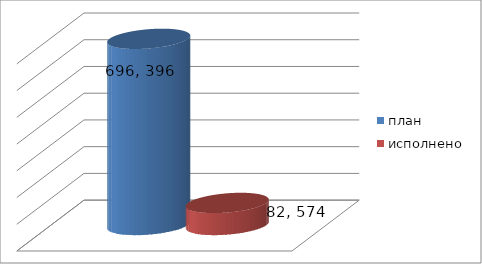
| Category | план | исполнено |
|---|---|---|
| 0 | 696396292.45 | 82574157.1 |